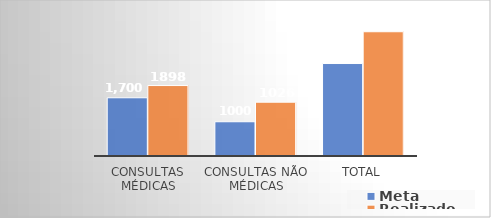
| Category | Meta | Realizado |
|---|---|---|
| Consultas Médicas | 1700 | 2057 |
| Consultas não médicas | 1000 | 1571 |
| Total | 2700 | 3628 |